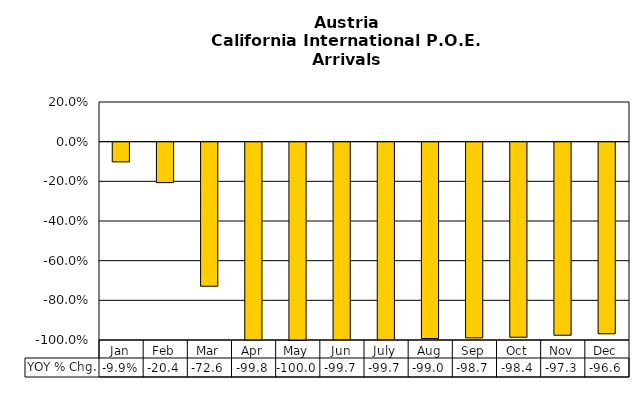
| Category | YOY % Chg. |
|---|---|
| Jan | -0.099 |
| Feb | -0.204 |
| Mar | -0.726 |
| Apr | -0.998 |
| May | -1 |
| Jun | -0.997 |
| July | -0.997 |
| Aug | -0.99 |
| Sep | -0.987 |
| Oct | -0.984 |
| Nov | -0.973 |
| Dec | -0.966 |